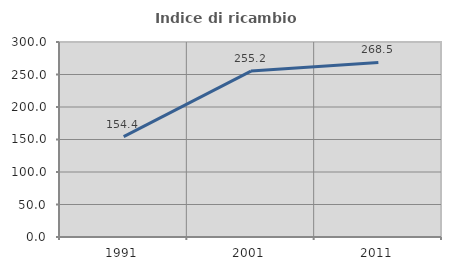
| Category | Indice di ricambio occupazionale  |
|---|---|
| 1991.0 | 154.43 |
| 2001.0 | 255.2 |
| 2011.0 | 268.504 |